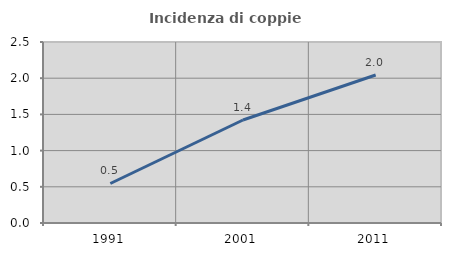
| Category | Incidenza di coppie miste |
|---|---|
| 1991.0 | 0.546 |
| 2001.0 | 1.423 |
| 2011.0 | 2.044 |